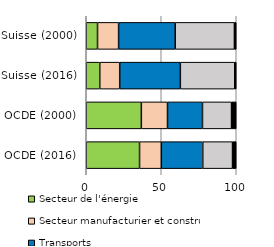
| Category | Secteur de l'énergie | Secteur manufacturier et construction | Transports | Autres secteurs | Autres |
|---|---|---|---|---|---|
| OCDE (2016) | 35.534 | 14.505 | 27.63 | 19.843 | 2.487 |
| OCDE (2000) | 36.728 | 17.431 | 23.339 | 19.351 | 3.15 |
| Suisse (2016) | 9.018 | 13.291 | 40.429 | 36.298 | 0.964 |
| Suisse (2000) | 7.519 | 14.045 | 37.758 | 39.466 | 1.212 |